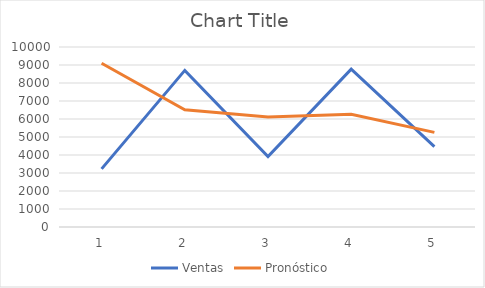
| Category | Ventas | Pronóstico |
|---|---|---|
| 0 | 3227.851 | 9100 |
| 1 | 8701.659 | 6516.255 |
| 2 | 3913.497 | 6108.96 |
| 3 | 8765.517 | 6266.868 |
| 4 | 4463.999 | 5257.156 |